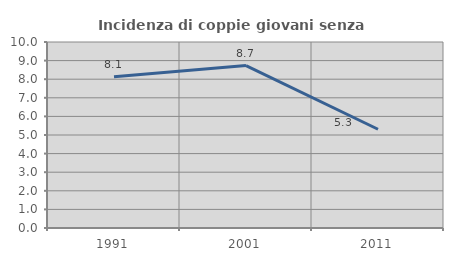
| Category | Incidenza di coppie giovani senza figli |
|---|---|
| 1991.0 | 8.13 |
| 2001.0 | 8.73 |
| 2011.0 | 5.31 |